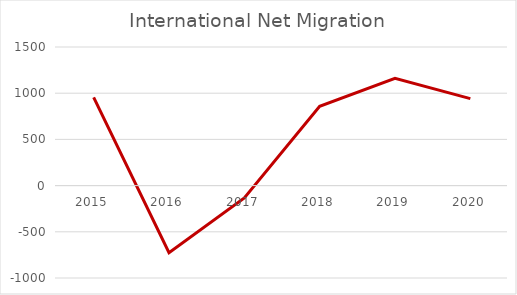
| Category | International Net Migration |
|---|---|
| 2015.0 | 954 |
| 2016.0 | -726 |
| 2017.0 | -134 |
| 2018.0 | 858 |
| 2019.0 | 1161 |
| 2020.0 | 941 |